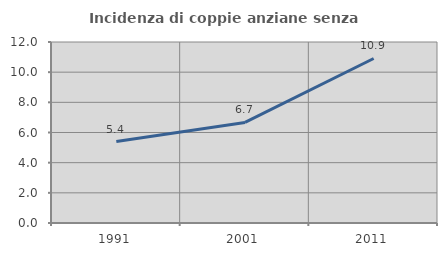
| Category | Incidenza di coppie anziane senza figli  |
|---|---|
| 1991.0 | 5.402 |
| 2001.0 | 6.665 |
| 2011.0 | 10.908 |